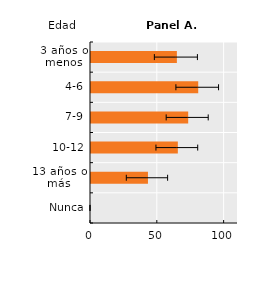
| Category | Series 0 |
|---|---|
| Nunca | 0 |
| 13 años o más | 42.622 |
| 10-12 | 64.974 |
| 7-9 | 72.731 |
| 4-6 | 80.233 |
| 3 años o menos | 64.263 |